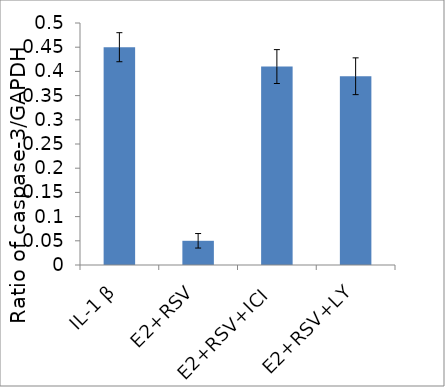
| Category | Series 0 |
|---|---|
| IL-1 β | 0.45 |
| E2+RSV | 0.05 |
| E2+RSV+ICI  | 0.41 |
| E2+RSV+LY | 0.39 |